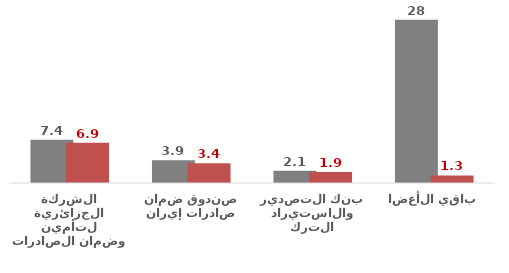
| Category | 2017 | 2018 |
|---|---|---|
| الشركة الجزائرية لتأمين وضمان الصادرات | 7.4 | 6.9 |
| صندوق ضمان صادرات إيران | 3.9 | 3.4 |
| بنك التصدير والاستيراد التركي | 2.1 | 1.9 |
| باقي الأعضاء | 28 | 1.3 |